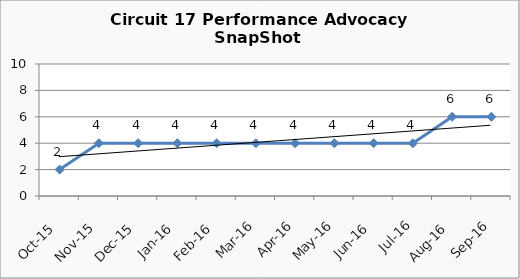
| Category | Circuit 17 |
|---|---|
| Oct-15 | 2 |
| Nov-15 | 4 |
| Dec-15 | 4 |
| Jan-16 | 4 |
| Feb-16 | 4 |
| Mar-16 | 4 |
| Apr-16 | 4 |
| May-16 | 4 |
| Jun-16 | 4 |
| Jul-16 | 4 |
| Aug-16 | 6 |
| Sep-16 | 6 |